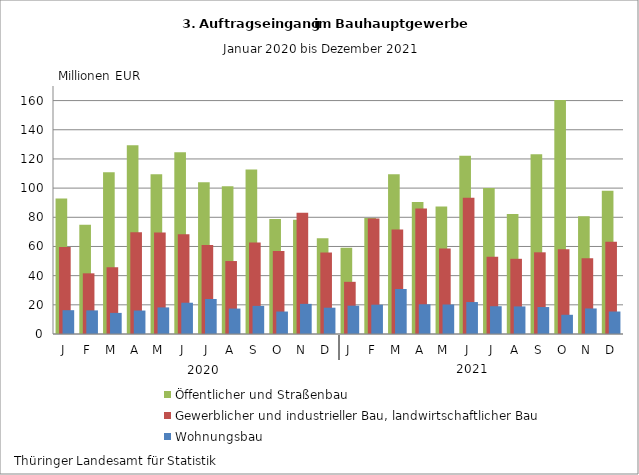
| Category | Öffentlicher und Straßenbau | Gewerblicher und industrieller Bau, landwirtschaftlicher Bau | Wohnungsbau |
|---|---|---|---|
| J | 92.884 | 59.676 | 16.317 |
| F | 74.93 | 41.589 | 16.181 |
| M | 110.829 | 45.773 | 14.469 |
| A | 129.402 | 69.805 | 16.076 |
| M | 109.423 | 69.565 | 18.232 |
| J | 124.616 | 68.306 | 21.434 |
| J | 104.001 | 61.055 | 24.007 |
| A | 101.27 | 50.014 | 17.435 |
| S | 112.783 | 62.704 | 19.28 |
| O | 78.824 | 56.908 | 15.402 |
| N | 78.251 | 83.144 | 20.651 |
| D | 65.683 | 55.86 | 18.035 |
| J | 59.109 | 35.77 | 19.421 |
| F | 79.576 | 79.228 | 20.073 |
| M | 109.533 | 71.656 | 30.863 |
| A | 90.552 | 86.092 | 20.386 |
| M | 87.369 | 58.552 | 20.211 |
| J | 122.263 | 93.332 | 21.901 |
| J | 100.013 | 52.948 | 19.043 |
| A | 82.176 | 51.546 | 18.899 |
| S | 123.226 | 55.994 | 18.476 |
| O | 160.412 | 58.167 | 13.169 |
| N | 80.68 | 51.865 | 17.514 |
| D | 98.174 | 63.292 | 15.409 |